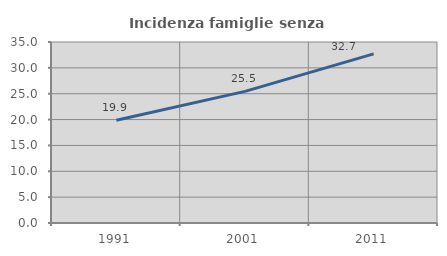
| Category | Incidenza famiglie senza nuclei |
|---|---|
| 1991.0 | 19.861 |
| 2001.0 | 25.458 |
| 2011.0 | 32.703 |